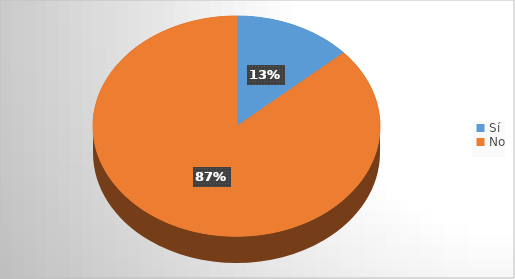
| Category | Series 0 |
|---|---|
| Sí | 158 |
| No | 1024 |